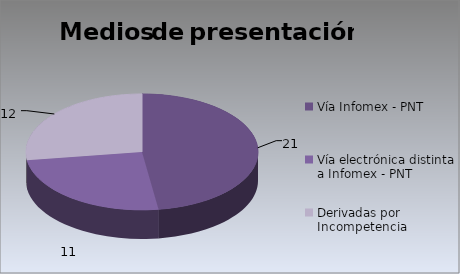
| Category | Series 0 |
|---|---|
| Vía Infomex - PNT | 21 |
| Vía electrónica distinta a Infomex - PNT | 11 |
| Derivadas por Incompetencia | 12 |